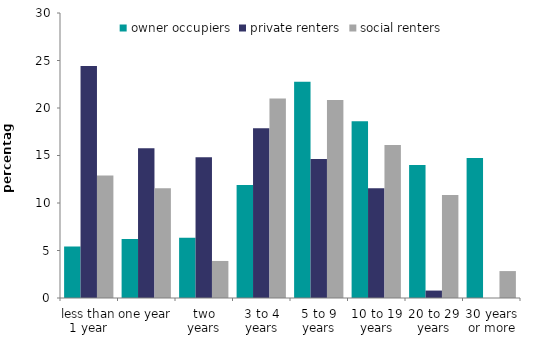
| Category | owner occupiers | private renters | social renters |
|---|---|---|---|
| less than 1 year | 5.426 | 24.42 | 12.905 |
| one year | 6.22 | 15.768 | 11.562 |
| two years | 6.352 | 14.804 | 3.899 |
| 3 to 4 years | 11.897 | 17.861 | 21.012 |
| 5 to 9 years | 22.759 | 14.628 | 20.845 |
| 10 to 19 years | 18.609 | 11.548 | 16.101 |
| 20 to 29 years | 14.003 | 0.782 | 10.841 |
| 30 years or more | 14.734 | 0.002 | 2.834 |